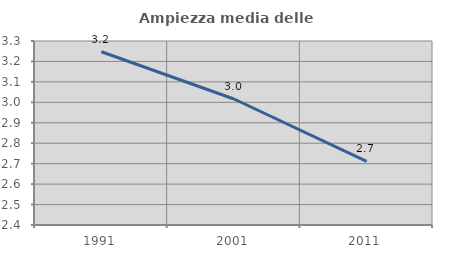
| Category | Ampiezza media delle famiglie |
|---|---|
| 1991.0 | 3.247 |
| 2001.0 | 3.016 |
| 2011.0 | 2.711 |